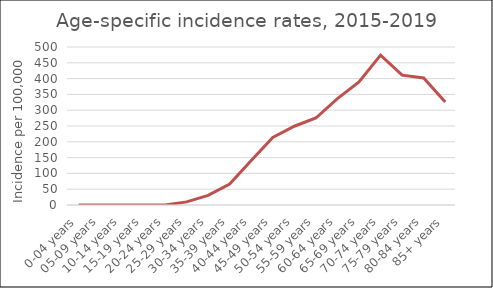
| Category | Series 1 |
|---|---|
| 0-04 years | 0 |
| 05-09 years | 0 |
| 10-14 years | 0 |
| 15-19 years | 0 |
| 20-24 years | 0 |
| 25-29 years | 9.87 |
| 30-34 years | 30.24 |
| 35-39 years | 66.47 |
| 40-44 years | 140.68 |
| 45-49 years | 213.58 |
| 50-54 years | 249.27 |
| 55-59 years | 275.33 |
| 60-64 years | 336.51 |
| 65-69 years | 389.6 |
| 70-74 years | 474.32 |
| 75-79 years | 410.98 |
| 80-84 years | 401.92 |
| 85+ years | 325.86 |